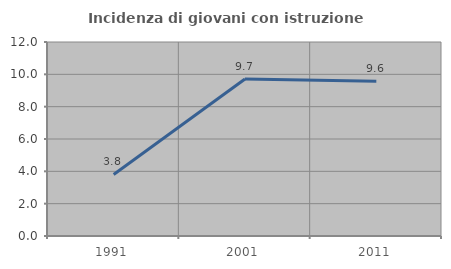
| Category | Incidenza di giovani con istruzione universitaria |
|---|---|
| 1991.0 | 3.81 |
| 2001.0 | 9.709 |
| 2011.0 | 9.574 |